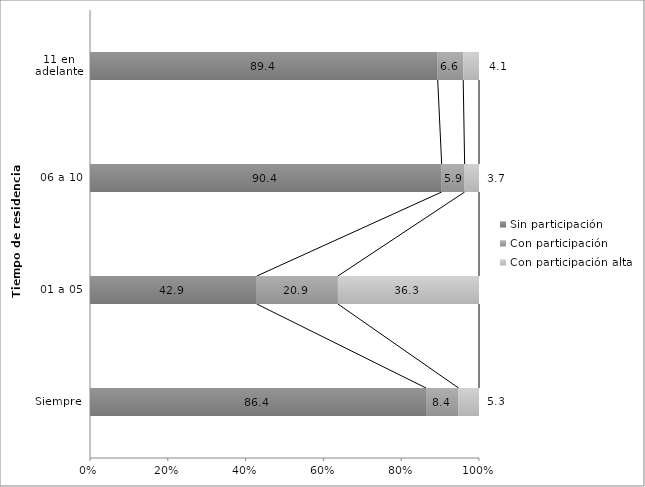
| Category | Sin participación | Con participación | Con participación alta |
|---|---|---|---|
| Siempre | 86.386 | 8.354 | 5.26 |
| 01 a 05 | 42.878 | 20.857 | 36.265 |
| 06 a 10 | 90.407 | 5.898 | 3.694 |
| 11 en adelante | 89.382 | 6.56 | 4.058 |